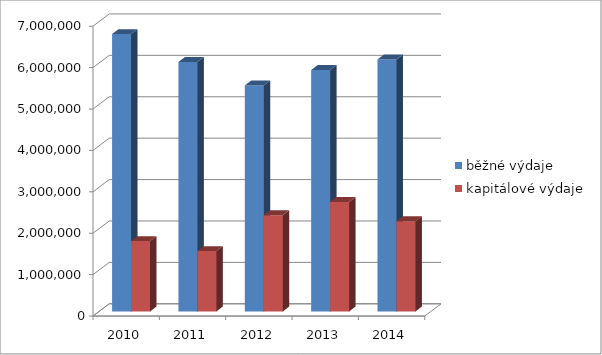
| Category | běžné výdaje | kapitálové výdaje |
|---|---|---|
| 2010.0 | 6699678 | 1699946 |
| 2011.0 | 6025427 | 1458095 |
| 2012.0 | 5459295 | 2326441 |
| 2013.0 | 5831442 | 2645599 |
| 2014.0 | 6088027 | 2178472 |